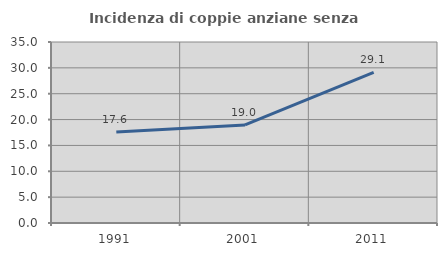
| Category | Incidenza di coppie anziane senza figli  |
|---|---|
| 1991.0 | 17.593 |
| 2001.0 | 18.966 |
| 2011.0 | 29.134 |